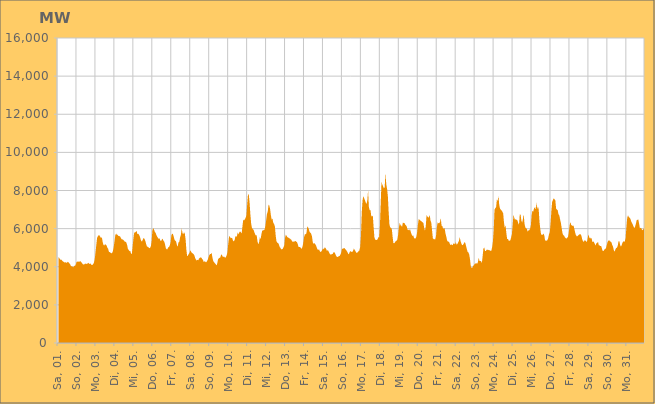
| Category | Series 0 |
|---|---|
|  Sa, 01.  | 4515.374 |
|  Sa, 01.  | 4466.4 |
|  Sa, 01.  | 4395.853 |
|  Sa, 01.  | 4356.709 |
|  Sa, 01.  | 4373.485 |
|  Sa, 01.  | 4304.034 |
|  Sa, 01.  | 4274.77 |
|  Sa, 01.  | 4244.679 |
|  Sa, 01.  | 4224.436 |
|  Sa, 01.  | 4237.908 |
|  Sa, 01.  | 4201.941 |
|  Sa, 01.  | 4225.963 |
|  Sa, 01.  | 4264.188 |
|  Sa, 01.  | 4222.887 |
|  Sa, 01.  | 4173.223 |
|  Sa, 01.  | 4116.857 |
|  Sa, 01.  | 4026.522 |
|  So, 02.  | 4023.394 |
|  So, 02.  | 4003.767 |
|  So, 02.  | 3977.357 |
|  So, 02.  | 4062.28 |
|  So, 02.  | 4038.656 |
|  So, 02.  | 4112.539 |
|  So, 02.  | 4249.366 |
|  So, 02.  | 4276.198 |
|  So, 02.  | 4259.583 |
|  So, 02.  | 4275.233 |
|  So, 02.  | 4266.116 |
|  So, 02.  | 4295.245 |
|  So, 02.  | 4240.133 |
|  So, 02.  | 4182.391 |
|  So, 02.  | 4130.788 |
|  So, 02.  | 4117.941 |
|  So, 02.  | 4129.443 |
|  So, 02.  | 4173.467 |
|  So, 02.  | 4137.298 |
|  So, 02.  | 4155.95 |
|  So, 02.  | 4174.599 |
|  So, 02.  | 4216.787 |
|  So, 02.  | 4135.927 |
|  So, 02.  | 4172.182 |
|  Mo, 03.  | 4157.104 |
|  Mo, 03.  | 4095.532 |
|  Mo, 03.  | 4094.304 |
|  Mo, 03.  | 4141.458 |
|  Mo, 03.  | 4212.251 |
|  Mo, 03.  | 4402.031 |
|  Mo, 03.  | 4756.425 |
|  Mo, 03.  | 5154.76 |
|  Mo, 03.  | 5514.726 |
|  Mo, 03.  | 5601.386 |
|  Mo, 03.  | 5656.249 |
|  Mo, 03.  | 5644.571 |
|  Mo, 03.  | 5568.403 |
|  Mo, 03.  | 5500.491 |
|  Mo, 03.  | 5555.046 |
|  Mo, 03.  | 5305.032 |
|  Mo, 03.  | 5154.332 |
|  Mo, 03.  | 5115.604 |
|  Mo, 03.  | 5180.153 |
|  Mo, 03.  | 5160.049 |
|  Mo, 03.  | 5111.358 |
|  Mo, 03.  | 4998.024 |
|  Mo, 03.  | 4934.722 |
|  Mo, 03.  | 4779.213 |
|  Di, 04.  | 4766.342 |
|  Di, 04.  | 4739.422 |
|  Di, 04.  | 4704.355 |
|  Di, 04.  | 4726.135 |
|  Di, 04.  | 4822.062 |
|  Di, 04.  | 5030.251 |
|  Di, 04.  | 5318.173 |
|  Di, 04.  | 5656.82 |
|  Di, 04.  | 5743.275 |
|  Di, 04.  | 5676.06 |
|  Di, 04.  | 5678.964 |
|  Di, 04.  | 5610.152 |
|  Di, 04.  | 5606.958 |
|  Di, 04.  | 5601.101 |
|  Di, 04.  | 5516.254 |
|  Di, 04.  | 5444.747 |
|  Di, 04.  | 5438.514 |
|  Di, 04.  | 5410.604 |
|  Di, 04.  | 5369.267 |
|  Di, 04.  | 5320.335 |
|  Di, 04.  | 5311.11 |
|  Di, 04.  | 5267.31 |
|  Di, 04.  | 5136.514 |
|  Di, 04.  | 4939.197 |
|  Mi, 05.  | 4882.74 |
|  Mi, 05.  | 4817.738 |
|  Mi, 05.  | 4827.51 |
|  Mi, 05.  | 4682.565 |
|  Mi, 05.  | 4689.104 |
|  Mi, 05.  | 5071.102 |
|  Mi, 05.  | 5493.757 |
|  Mi, 05.  | 5798.988 |
|  Mi, 05.  | 5801.56 |
|  Mi, 05.  | 5833.091 |
|  Mi, 05.  | 5884.497 |
|  Mi, 05.  | 5711.236 |
|  Mi, 05.  | 5731.387 |
|  Mi, 05.  | 5689.888 |
|  Mi, 05.  | 5594.432 |
|  Mi, 05.  | 5457.081 |
|  Mi, 05.  | 5336.947 |
|  Mi, 05.  | 5342.247 |
|  Mi, 05.  | 5437.397 |
|  Mi, 05.  | 5511.779 |
|  Mi, 05.  | 5460.856 |
|  Mi, 05.  | 5360.618 |
|  Mi, 05.  | 5206.495 |
|  Mi, 05.  | 5072.124 |
|  Do, 06.  | 5048.395 |
|  Do, 06.  | 5022.711 |
|  Do, 06.  | 4971.735 |
|  Do, 06.  | 4993.192 |
|  Do, 06.  | 5068.157 |
|  Do, 06.  | 5346.334 |
|  Do, 06.  | 5912.866 |
|  Do, 06.  | 6025.915 |
|  Do, 06.  | 5954.183 |
|  Do, 06.  | 5835.104 |
|  Do, 06.  | 5785.556 |
|  Do, 06.  | 5667.004 |
|  Do, 06.  | 5584.961 |
|  Do, 06.  | 5518.086 |
|  Do, 06.  | 5455.017 |
|  Do, 06.  | 5495.761 |
|  Do, 06.  | 5369.716 |
|  Do, 06.  | 5352.923 |
|  Do, 06.  | 5433.391 |
|  Do, 06.  | 5467.548 |
|  Do, 06.  | 5358.082 |
|  Do, 06.  | 5320.249 |
|  Do, 06.  | 5171.811 |
|  Do, 06.  | 4971.577 |
|  Fr, 07.  | 4914.447 |
|  Fr, 07.  | 4924.778 |
|  Fr, 07.  | 5022.013 |
|  Fr, 07.  | 5034.537 |
|  Fr, 07.  | 5120.848 |
|  Fr, 07.  | 5277.951 |
|  Fr, 07.  | 5641.989 |
|  Fr, 07.  | 5736.357 |
|  Fr, 07.  | 5711.392 |
|  Fr, 07.  | 5577.964 |
|  Fr, 07.  | 5417.595 |
|  Fr, 07.  | 5361.675 |
|  Fr, 07.  | 5321.267 |
|  Fr, 07.  | 5148.339 |
|  Fr, 07.  | 5051.377 |
|  Fr, 07.  | 5281.809 |
|  Fr, 07.  | 5302.998 |
|  Fr, 07.  | 5532.452 |
|  Fr, 07.  | 5662.798 |
|  Fr, 07.  | 6014.399 |
|  Fr, 07.  | 5780.376 |
|  Fr, 07.  | 5703.029 |
|  Fr, 07.  | 5811.907 |
|  Fr, 07.  | 5741.005 |
|  Sa, 08.  | 5446.14 |
|  Sa, 08.  | 4890.321 |
|  Sa, 08.  | 4543.367 |
|  Sa, 08.  | 4601.208 |
|  Sa, 08.  | 4672.607 |
|  Sa, 08.  | 4729.331 |
|  Sa, 08.  | 4865.89 |
|  Sa, 08.  | 4790.849 |
|  Sa, 08.  | 4721.167 |
|  Sa, 08.  | 4707.482 |
|  Sa, 08.  | 4662.575 |
|  Sa, 08.  | 4611.65 |
|  Sa, 08.  | 4470.41 |
|  Sa, 08.  | 4377.478 |
|  Sa, 08.  | 4331.46 |
|  Sa, 08.  | 4364.93 |
|  Sa, 08.  | 4334.376 |
|  Sa, 08.  | 4435.338 |
|  Sa, 08.  | 4462.657 |
|  Sa, 08.  | 4496.881 |
|  Sa, 08.  | 4475.555 |
|  Sa, 08.  | 4401.364 |
|  Sa, 08.  | 4357.075 |
|  Sa, 08.  | 4248.061 |
|  So, 09.  | 4291.801 |
|  So, 09.  | 4262.993 |
|  So, 09.  | 4230.488 |
|  So, 09.  | 4290.055 |
|  So, 09.  | 4363.259 |
|  So, 09.  | 4495.959 |
|  So, 09.  | 4611.36 |
|  So, 09.  | 4668.053 |
|  So, 09.  | 4670.468 |
|  So, 09.  | 4727.82 |
|  So, 09.  | 4470.799 |
|  So, 09.  | 4298.504 |
|  So, 09.  | 4240.118 |
|  So, 09.  | 4187.644 |
|  So, 09.  | 4147.042 |
|  So, 09.  | 4071.623 |
|  So, 09.  | 4159.33 |
|  So, 09.  | 4374.803 |
|  So, 09.  | 4449.328 |
|  So, 09.  | 4463.472 |
|  So, 09.  | 4490.968 |
|  So, 09.  | 4644.36 |
|  So, 09.  | 4620.429 |
|  So, 09.  | 4530.405 |
|  Mo, 10.  | 4523.441 |
|  Mo, 10.  | 4525.085 |
|  Mo, 10.  | 4469.78 |
|  Mo, 10.  | 4502.618 |
|  Mo, 10.  | 4607.759 |
|  Mo, 10.  | 4761.877 |
|  Mo, 10.  | 5204.364 |
|  Mo, 10.  | 5571.499 |
|  Mo, 10.  | 5602.365 |
|  Mo, 10.  | 5497.257 |
|  Mo, 10.  | 5515.683 |
|  Mo, 10.  | 5501.337 |
|  Mo, 10.  | 5375.481 |
|  Mo, 10.  | 5328.118 |
|  Mo, 10.  | 5394.264 |
|  Mo, 10.  | 5596.603 |
|  Mo, 10.  | 5578.825 |
|  Mo, 10.  | 5606.768 |
|  Mo, 10.  | 5809.694 |
|  Mo, 10.  | 5692.747 |
|  Mo, 10.  | 5809.945 |
|  Mo, 10.  | 5856.049 |
|  Mo, 10.  | 5803.368 |
|  Mo, 10.  | 5751.743 |
|  Di, 11.  | 6137.726 |
|  Di, 11.  | 6467.979 |
|  Di, 11.  | 6427.883 |
|  Di, 11.  | 6490.885 |
|  Di, 11.  | 6568.854 |
|  Di, 11.  | 6706.755 |
|  Di, 11.  | 7293.349 |
|  Di, 11.  | 7798.792 |
|  Di, 11.  | 7786.104 |
|  Di, 11.  | 7362.783 |
|  Di, 11.  | 6748.341 |
|  Di, 11.  | 6260.26 |
|  Di, 11.  | 6038.2 |
|  Di, 11.  | 5978.782 |
|  Di, 11.  | 5940.591 |
|  Di, 11.  | 5819.805 |
|  Di, 11.  | 5703.251 |
|  Di, 11.  | 5640.76 |
|  Di, 11.  | 5649.777 |
|  Di, 11.  | 5326.516 |
|  Di, 11.  | 5181.422 |
|  Di, 11.  | 5278.696 |
|  Di, 11.  | 5546.464 |
|  Di, 11.  | 5451.49 |
|  Mi, 12.  | 5716.575 |
|  Mi, 12.  | 5890.483 |
|  Mi, 12.  | 5912.69 |
|  Mi, 12.  | 5919.19 |
|  Mi, 12.  | 5954.439 |
|  Mi, 12.  | 6137.169 |
|  Mi, 12.  | 6439.686 |
|  Mi, 12.  | 6772.004 |
|  Mi, 12.  | 6900.589 |
|  Mi, 12.  | 7251.885 |
|  Mi, 12.  | 7209.128 |
|  Mi, 12.  | 7018.468 |
|  Mi, 12.  | 6690.786 |
|  Mi, 12.  | 6471.247 |
|  Mi, 12.  | 6527.324 |
|  Mi, 12.  | 6303.139 |
|  Mi, 12.  | 6246.006 |
|  Mi, 12.  | 6116.325 |
|  Mi, 12.  | 5657.127 |
|  Mi, 12.  | 5335.61 |
|  Mi, 12.  | 5261.915 |
|  Mi, 12.  | 5248.411 |
|  Mi, 12.  | 5181.144 |
|  Mi, 12.  | 5044.237 |
|  Do, 13.  | 4993.328 |
|  Do, 13.  | 4917.906 |
|  Do, 13.  | 4912.746 |
|  Do, 13.  | 4938.539 |
|  Do, 13.  | 5031.67 |
|  Do, 13.  | 5136.444 |
|  Do, 13.  | 5541.135 |
|  Do, 13.  | 5691.696 |
|  Do, 13.  | 5605.497 |
|  Do, 13.  | 5549.081 |
|  Do, 13.  | 5524.496 |
|  Do, 13.  | 5502.652 |
|  Do, 13.  | 5481.436 |
|  Do, 13.  | 5436.789 |
|  Do, 13.  | 5408.605 |
|  Do, 13.  | 5312.101 |
|  Do, 13.  | 5329.824 |
|  Do, 13.  | 5309.29 |
|  Do, 13.  | 5331.55 |
|  Do, 13.  | 5352.368 |
|  Do, 13.  | 5320.204 |
|  Do, 13.  | 5289.864 |
|  Do, 13.  | 5185.288 |
|  Do, 13.  | 5040.555 |
|  Fr, 14.  | 5042.185 |
|  Fr, 14.  | 5025.916 |
|  Fr, 14.  | 4987.651 |
|  Fr, 14.  | 4938.737 |
|  Fr, 14.  | 5061.267 |
|  Fr, 14.  | 5265.668 |
|  Fr, 14.  | 5551.416 |
|  Fr, 14.  | 5705.314 |
|  Fr, 14.  | 5707.962 |
|  Fr, 14.  | 5757.597 |
|  Fr, 14.  | 6116.385 |
|  Fr, 14.  | 6064.245 |
|  Fr, 14.  | 5976.268 |
|  Fr, 14.  | 5821.982 |
|  Fr, 14.  | 5786.84 |
|  Fr, 14.  | 5726.208 |
|  Fr, 14.  | 5586.633 |
|  Fr, 14.  | 5273.43 |
|  Fr, 14.  | 5206.262 |
|  Fr, 14.  | 5239.866 |
|  Fr, 14.  | 5188.588 |
|  Fr, 14.  | 5125.205 |
|  Fr, 14.  | 5012.976 |
|  Fr, 14.  | 4905.898 |
|  Sa, 15.  | 4885.058 |
|  Sa, 15.  | 4906.028 |
|  Sa, 15.  | 4806.051 |
|  Sa, 15.  | 4765.152 |
|  Sa, 15.  | 4814.593 |
|  Sa, 15.  | 4889.311 |
|  Sa, 15.  | 4961.761 |
|  Sa, 15.  | 4917.291 |
|  Sa, 15.  | 5008.269 |
|  Sa, 15.  | 4992.752 |
|  Sa, 15.  | 4923.662 |
|  Sa, 15.  | 4817.824 |
|  Sa, 15.  | 4879.109 |
|  Sa, 15.  | 4809.02 |
|  Sa, 15.  | 4712.423 |
|  Sa, 15.  | 4669.197 |
|  Sa, 15.  | 4613.047 |
|  Sa, 15.  | 4671.438 |
|  Sa, 15.  | 4665.736 |
|  Sa, 15.  | 4744.885 |
|  Sa, 15.  | 4774.064 |
|  Sa, 15.  | 4716.421 |
|  Sa, 15.  | 4625.842 |
|  Sa, 15.  | 4541.088 |
|  So, 16.  | 4507.835 |
|  So, 16.  | 4524.345 |
|  So, 16.  | 4555.598 |
|  So, 16.  | 4568.945 |
|  So, 16.  | 4640.619 |
|  So, 16.  | 4749.091 |
|  So, 16.  | 4940.07 |
|  So, 16.  | 4944.339 |
|  So, 16.  | 4968.833 |
|  So, 16.  | 4979.689 |
|  So, 16.  | 4933.746 |
|  So, 16.  | 4890.199 |
|  So, 16.  | 4823.841 |
|  So, 16.  | 4761.877 |
|  So, 16.  | 4649.752 |
|  So, 16.  | 4696.253 |
|  So, 16.  | 4796.386 |
|  So, 16.  | 4816.798 |
|  So, 16.  | 4773.62 |
|  So, 16.  | 4773.142 |
|  So, 16.  | 4838.989 |
|  So, 16.  | 4955.106 |
|  So, 16.  | 4885.354 |
|  So, 16.  | 4822.931 |
|  Mo, 17.  | 4728.309 |
|  Mo, 17.  | 4735.185 |
|  Mo, 17.  | 4763.138 |
|  Mo, 17.  | 4820.29 |
|  Mo, 17.  | 4858.505 |
|  Mo, 17.  | 5040.19 |
|  Mo, 17.  | 5642.576 |
|  Mo, 17.  | 6852.654 |
|  Mo, 17.  | 7489.386 |
|  Mo, 17.  | 7701.168 |
|  Mo, 17.  | 7594.702 |
|  Mo, 17.  | 7491.784 |
|  Mo, 17.  | 7374.963 |
|  Mo, 17.  | 7293.739 |
|  Mo, 17.  | 7467.625 |
|  Mo, 17.  | 7998.611 |
|  Mo, 17.  | 7139.478 |
|  Mo, 17.  | 6964.012 |
|  Mo, 17.  | 6979.211 |
|  Mo, 17.  | 6664.659 |
|  Mo, 17.  | 6633.418 |
|  Mo, 17.  | 6685.501 |
|  Mo, 17.  | 6069.79 |
|  Mo, 17.  | 5540.776 |
|  Di, 18.  | 5424.337 |
|  Di, 18.  | 5413.829 |
|  Di, 18.  | 5395.643 |
|  Di, 18.  | 5446.794 |
|  Di, 18.  | 5544.937 |
|  Di, 18.  | 5547.09 |
|  Di, 18.  | 6168.534 |
|  Di, 18.  | 7364.207 |
|  Di, 18.  | 8469.441 |
|  Di, 18.  | 8304.896 |
|  Di, 18.  | 8219.428 |
|  Di, 18.  | 8110.78 |
|  Di, 18.  | 8168.237 |
|  Di, 18.  | 8921.174 |
|  Di, 18.  | 8328.92 |
|  Di, 18.  | 8100.012 |
|  Di, 18.  | 7720.232 |
|  Di, 18.  | 6898.038 |
|  Di, 18.  | 6214.592 |
|  Di, 18.  | 6067.706 |
|  Di, 18.  | 6037.039 |
|  Di, 18.  | 5989.821 |
|  Di, 18.  | 5586.563 |
|  Di, 18.  | 5250.992 |
|  Mi, 19.  | 5227.427 |
|  Mi, 19.  | 5283.461 |
|  Mi, 19.  | 5342.428 |
|  Mi, 19.  | 5372.542 |
|  Mi, 19.  | 5420.261 |
|  Mi, 19.  | 5672.039 |
|  Mi, 19.  | 6055.411 |
|  Mi, 19.  | 6305.945 |
|  Mi, 19.  | 6187.273 |
|  Mi, 19.  | 6152.926 |
|  Mi, 19.  | 6096.593 |
|  Mi, 19.  | 6310.188 |
|  Mi, 19.  | 6301.26 |
|  Mi, 19.  | 6300.579 |
|  Mi, 19.  | 6207.403 |
|  Mi, 19.  | 6176.1 |
|  Mi, 19.  | 6105.141 |
|  Mi, 19.  | 5937.495 |
|  Mi, 19.  | 5935.353 |
|  Mi, 19.  | 5902.041 |
|  Mi, 19.  | 5979.601 |
|  Mi, 19.  | 5835.654 |
|  Mi, 19.  | 5708.532 |
|  Mi, 19.  | 5617.892 |
|  Do, 20.  | 5647.208 |
|  Do, 20.  | 5525.343 |
|  Do, 20.  | 5480.3 |
|  Do, 20.  | 5478.687 |
|  Do, 20.  | 5558.071 |
|  Do, 20.  | 5782.713 |
|  Do, 20.  | 6185.12 |
|  Do, 20.  | 6493.424 |
|  Do, 20.  | 6471.474 |
|  Do, 20.  | 6425.931 |
|  Do, 20.  | 6402.63 |
|  Do, 20.  | 6363.38 |
|  Do, 20.  | 6330.804 |
|  Do, 20.  | 6300.008 |
|  Do, 20.  | 6034.217 |
|  Do, 20.  | 5895.246 |
|  Do, 20.  | 6117.747 |
|  Do, 20.  | 6713.907 |
|  Do, 20.  | 6637.817 |
|  Do, 20.  | 6601.612 |
|  Do, 20.  | 6577.372 |
|  Do, 20.  | 6727.957 |
|  Do, 20.  | 6418.303 |
|  Do, 20.  | 6310.248 |
|  Fr, 21.  | 5899.675 |
|  Fr, 21.  | 5492.868 |
|  Fr, 21.  | 5448.296 |
|  Fr, 21.  | 5449.01 |
|  Fr, 21.  | 5431.498 |
|  Fr, 21.  | 5618.133 |
|  Fr, 21.  | 6060.16 |
|  Fr, 21.  | 6321.464 |
|  Fr, 21.  | 6289.047 |
|  Fr, 21.  | 6286.807 |
|  Fr, 21.  | 6342.543 |
|  Fr, 21.  | 6550.667 |
|  Fr, 21.  | 6154.375 |
|  Fr, 21.  | 6139.541 |
|  Fr, 21.  | 5977.829 |
|  Fr, 21.  | 6049.013 |
|  Fr, 21.  | 5990.994 |
|  Fr, 21.  | 5746.745 |
|  Fr, 21.  | 5573.443 |
|  Fr, 21.  | 5376.66 |
|  Fr, 21.  | 5323.16 |
|  Fr, 21.  | 5315.814 |
|  Fr, 21.  | 5264.19 |
|  Fr, 21.  | 5138.042 |
|  Sa, 22.  | 5173.939 |
|  Sa, 22.  | 5160.199 |
|  Sa, 22.  | 5123.358 |
|  Sa, 22.  | 5229.559 |
|  Sa, 22.  | 5212.565 |
|  Sa, 22.  | 5170.845 |
|  Sa, 22.  | 5299.275 |
|  Sa, 22.  | 5160.674 |
|  Sa, 22.  | 5193.086 |
|  Sa, 22.  | 5278.295 |
|  Sa, 22.  | 5361.74 |
|  Sa, 22.  | 5562.172 |
|  Sa, 22.  | 5353.413 |
|  Sa, 22.  | 5229.951 |
|  Sa, 22.  | 5131.764 |
|  Sa, 22.  | 5146.103 |
|  Sa, 22.  | 5203.722 |
|  Sa, 22.  | 5298.198 |
|  Sa, 22.  | 5256.087 |
|  Sa, 22.  | 5094.585 |
|  Sa, 22.  | 4926.037 |
|  Sa, 22.  | 4776.276 |
|  Sa, 22.  | 4758.548 |
|  Sa, 22.  | 4635.371 |
|  So, 23.  | 4396.486 |
|  So, 23.  | 4021.766 |
|  So, 23.  | 3934.27 |
|  So, 23.  | 3953.574 |
|  So, 23.  | 4041.077 |
|  So, 23.  | 4090.418 |
|  So, 23.  | 4153.294 |
|  So, 23.  | 4173.181 |
|  So, 23.  | 4185.484 |
|  So, 23.  | 4162.278 |
|  So, 23.  | 4236.711 |
|  So, 23.  | 4465.761 |
|  So, 23.  | 4307.634 |
|  So, 23.  | 4298.489 |
|  So, 23.  | 4290.718 |
|  So, 23.  | 4197.342 |
|  So, 23.  | 4558.674 |
|  So, 23.  | 4958.935 |
|  So, 23.  | 5013.504 |
|  So, 23.  | 4833.422 |
|  So, 23.  | 4825.697 |
|  So, 23.  | 4889.311 |
|  So, 23.  | 4893.236 |
|  So, 23.  | 4892.219 |
|  Mo, 24.  | 4859.5 |
|  Mo, 24.  | 4871.408 |
|  Mo, 24.  | 4826.685 |
|  Mo, 24.  | 4845.669 |
|  Mo, 24.  | 5020.539 |
|  Mo, 24.  | 5331.682 |
|  Mo, 24.  | 5900.699 |
|  Mo, 24.  | 6989.842 |
|  Mo, 24.  | 7078.909 |
|  Mo, 24.  | 7117.161 |
|  Mo, 24.  | 7511.635 |
|  Mo, 24.  | 7465.534 |
|  Mo, 24.  | 7707.987 |
|  Mo, 24.  | 7248.514 |
|  Mo, 24.  | 7042.974 |
|  Mo, 24.  | 6997.846 |
|  Mo, 24.  | 6945.703 |
|  Mo, 24.  | 6888.565 |
|  Mo, 24.  | 6797.712 |
|  Mo, 24.  | 6330.677 |
|  Mo, 24.  | 6039.162 |
|  Mo, 24.  | 6176.378 |
|  Mo, 24.  | 5764.903 |
|  Mo, 24.  | 5452.88 |
|  Di, 25.  | 5463.971 |
|  Di, 25.  | 5372.054 |
|  Di, 25.  | 5360.863 |
|  Di, 25.  | 5382.099 |
|  Di, 25.  | 5527.985 |
|  Di, 25.  | 5710.531 |
|  Di, 25.  | 6187.57 |
|  Di, 25.  | 6728.667 |
|  Di, 25.  | 6576.204 |
|  Di, 25.  | 6460.487 |
|  Di, 25.  | 6510.853 |
|  Di, 25.  | 6451.143 |
|  Di, 25.  | 6440.386 |
|  Di, 25.  | 6291.381 |
|  Di, 25.  | 6198.064 |
|  Di, 25.  | 6747.882 |
|  Di, 25.  | 6738.715 |
|  Di, 25.  | 6435.379 |
|  Di, 25.  | 6312.468 |
|  Di, 25.  | 6509.977 |
|  Di, 25.  | 6750.508 |
|  Di, 25.  | 6251.253 |
|  Di, 25.  | 6061.382 |
|  Di, 25.  | 6025.559 |
|  Mi, 26.  | 5979.141 |
|  Mi, 26.  | 5839.614 |
|  Mi, 26.  | 5909.825 |
|  Mi, 26.  | 5923.226 |
|  Mi, 26.  | 5989.233 |
|  Mi, 26.  | 6166.311 |
|  Mi, 26.  | 6708.21 |
|  Mi, 26.  | 6941.967 |
|  Mi, 26.  | 6882.391 |
|  Mi, 26.  | 7055.457 |
|  Mi, 26.  | 7124.017 |
|  Mi, 26.  | 7005.274 |
|  Mi, 26.  | 7354.98 |
|  Mi, 26.  | 7034.316 |
|  Mi, 26.  | 7160.032 |
|  Mi, 26.  | 6985.9 |
|  Mi, 26.  | 6337.685 |
|  Mi, 26.  | 5974.103 |
|  Mi, 26.  | 5692.034 |
|  Mi, 26.  | 5682.715 |
|  Mi, 26.  | 5679.493 |
|  Mi, 26.  | 5741.4 |
|  Mi, 26.  | 5653.355 |
|  Mi, 26.  | 5382.107 |
|  Do, 27.  | 5375.662 |
|  Do, 27.  | 5366.221 |
|  Do, 27.  | 5397.673 |
|  Do, 27.  | 5508.241 |
|  Do, 27.  | 5706.326 |
|  Do, 27.  | 5803.134 |
|  Do, 27.  | 6289.172 |
|  Do, 27.  | 6942.45 |
|  Do, 27.  | 7413.848 |
|  Do, 27.  | 7502.768 |
|  Do, 27.  | 7596.48 |
|  Do, 27.  | 7535.481 |
|  Do, 27.  | 7482.723 |
|  Do, 27.  | 7051.048 |
|  Do, 27.  | 7003.981 |
|  Do, 27.  | 6968.083 |
|  Do, 27.  | 6744.184 |
|  Do, 27.  | 6698.149 |
|  Do, 27.  | 6485.602 |
|  Do, 27.  | 6307.774 |
|  Do, 27.  | 6039.797 |
|  Do, 27.  | 5770.95 |
|  Do, 27.  | 5660.795 |
|  Do, 27.  | 5638.391 |
|  Fr, 28.  | 5552.409 |
|  Fr, 28.  | 5503.163 |
|  Fr, 28.  | 5473.935 |
|  Fr, 28.  | 5531.392 |
|  Fr, 28.  | 5552.421 |
|  Fr, 28.  | 5786.996 |
|  Fr, 28.  | 6157.588 |
|  Fr, 28.  | 6345.153 |
|  Fr, 28.  | 6206.559 |
|  Fr, 28.  | 6166.706 |
|  Fr, 28.  | 6140.899 |
|  Fr, 28.  | 6168.81 |
|  Fr, 28.  | 5997.433 |
|  Fr, 28.  | 5808.407 |
|  Fr, 28.  | 5667.791 |
|  Fr, 28.  | 5600.796 |
|  Fr, 28.  | 5606.085 |
|  Fr, 28.  | 5643.587 |
|  Fr, 28.  | 5686.294 |
|  Fr, 28.  | 5711.615 |
|  Fr, 28.  | 5701.906 |
|  Fr, 28.  | 5629.23 |
|  Fr, 28.  | 5443.53 |
|  Fr, 28.  | 5336.985 |
|  Sa, 29.  | 5306.959 |
|  Sa, 29.  | 5388.274 |
|  Sa, 29.  | 5378.878 |
|  Sa, 29.  | 5328.98 |
|  Sa, 29.  | 5307.093 |
|  Sa, 29.  | 5507.294 |
|  Sa, 29.  | 5705.176 |
|  Sa, 29.  | 5538.928 |
|  Sa, 29.  | 5470.351 |
|  Sa, 29.  | 5529.654 |
|  Sa, 29.  | 5472.129 |
|  Sa, 29.  | 5286.761 |
|  Sa, 29.  | 5334.732 |
|  Sa, 29.  | 5284.602 |
|  Sa, 29.  | 5193.61 |
|  Sa, 29.  | 5110.562 |
|  Sa, 29.  | 5233.528 |
|  Sa, 29.  | 5249.421 |
|  Sa, 29.  | 5311.583 |
|  Sa, 29.  | 5133.18 |
|  Sa, 29.  | 5118.668 |
|  Sa, 29.  | 5082.067 |
|  Sa, 29.  | 5085.471 |
|  Sa, 29.  | 4953.523 |
|  So, 30.  | 4823.663 |
|  So, 30.  | 4827.76 |
|  So, 30.  | 4890.373 |
|  So, 30.  | 4948.049 |
|  So, 30.  | 4953.783 |
|  So, 30.  | 5120.753 |
|  So, 30.  | 5278.36 |
|  So, 30.  | 5360.663 |
|  So, 30.  | 5397.604 |
|  So, 30.  | 5343.75 |
|  So, 30.  | 5317.273 |
|  So, 30.  | 5289.798 |
|  So, 30.  | 5144.868 |
|  So, 30.  | 5057.208 |
|  So, 30.  | 4869.829 |
|  So, 30.  | 4788.977 |
|  So, 30.  | 4899.917 |
|  So, 30.  | 4987.628 |
|  So, 30.  | 4992.828 |
|  So, 30.  | 5106.166 |
|  So, 30.  | 5330.782 |
|  So, 30.  | 5344.092 |
|  So, 30.  | 5150.372 |
|  So, 30.  | 5054.76 |
|  Mo, 31.  | 5137.212 |
|  Mo, 31.  | 5262.679 |
|  Mo, 31.  | 5333.838 |
|  Mo, 31.  | 5311.953 |
|  Mo, 31.  | 5327.561 |
|  Mo, 31.  | 5528.213 |
|  Mo, 31.  | 6104.338 |
|  Mo, 31.  | 6570.912 |
|  Mo, 31.  | 6704.472 |
|  Mo, 31.  | 6607.645 |
|  Mo, 31.  | 6572.445 |
|  Mo, 31.  | 6519.147 |
|  Mo, 31.  | 6383.33 |
|  Mo, 31.  | 6292.56 |
|  Mo, 31.  | 6222.562 |
|  Mo, 31.  | 6110.333 |
|  Mo, 31.  | 6024.598 |
|  Mo, 31.  | 6108.449 |
|  Mo, 31.  | 6263.963 |
|  Mo, 31.  | 6444.908 |
|  Mo, 31.  | 6458.468 |
|  Mo, 31.  | 6489.816 |
|  Mo, 31.  | 6267.981 |
|  Mo, 31.  | 6024.474 |
|  Di, 01.  | 6040.383 |
|  Di, 01.  | 6010.588 |
|  Di, 01.  | 5915.778 |
|  Di, 01.  | 5942.183 |
|  Di, 01.  | 6010.675 |
|  Di, 01.  | 6158.759 |